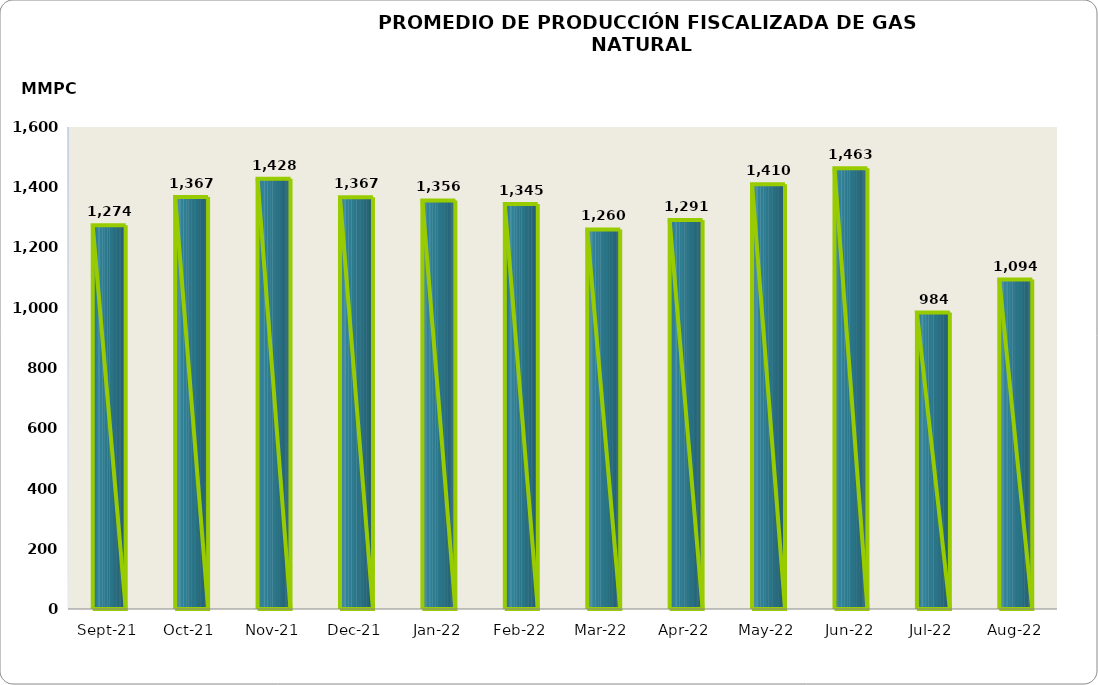
| Category | Series 0 |
|---|---|
| 2021-09-01 | 1273570.561 |
| 2021-10-01 | 1367318.609 |
| 2021-11-01 | 1428097.616 |
| 2021-12-01 | 1366833.527 |
| 2022-01-01 | 1356402.082 |
| 2022-02-01 | 1344504.622 |
| 2022-03-01 | 1259914.198 |
| 2022-04-01 | 1291170.944 |
| 2022-05-01 | 1410361.644 |
| 2022-06-01 | 1462840.082 |
| 2022-07-01 | 983913.442 |
| 2022-08-01 | 1093528.82 |